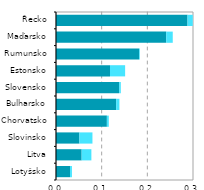
| Category |  ICT služby |  ICT zpracovatelský průmysl |
|---|---|---|
| Lotyšsko | 0.031 | 0.004 |
| Litva | 0.056 | 0.021 |
| Slovinsko | 0.051 | 0.029 |
| Chorvatsko | 0.111 | 0.004 |
| Bulharsko | 0.132 | 0.007 |
| Slovensko | 0.138 | 0.004 |
| Estonsko | 0.118 | 0.033 |
| Rumunsko | 0.182 | 0.002 |
| Maďarsko | 0.241 | 0.014 |
| Řecko | 0.288 | 0.011 |